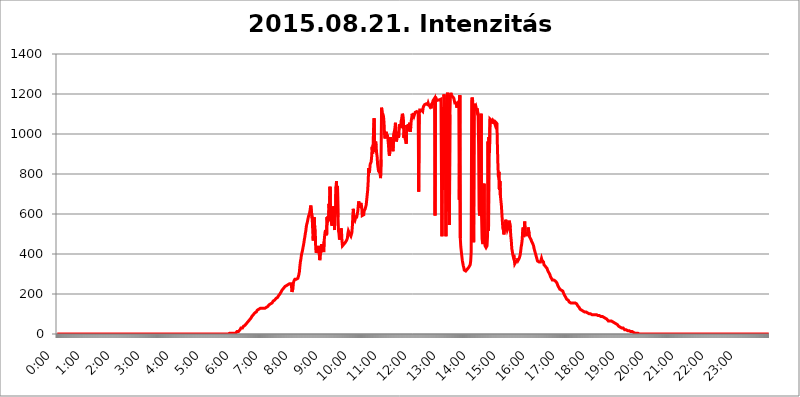
| Category | 2015.08.21. Intenzitás [W/m^2] |
|---|---|
| 0.0 | 0 |
| 0.0006944444444444445 | 0 |
| 0.001388888888888889 | 0 |
| 0.0020833333333333333 | 0 |
| 0.002777777777777778 | 0 |
| 0.003472222222222222 | 0 |
| 0.004166666666666667 | 0 |
| 0.004861111111111111 | 0 |
| 0.005555555555555556 | 0 |
| 0.0062499999999999995 | 0 |
| 0.006944444444444444 | 0 |
| 0.007638888888888889 | 0 |
| 0.008333333333333333 | 0 |
| 0.009027777777777779 | 0 |
| 0.009722222222222222 | 0 |
| 0.010416666666666666 | 0 |
| 0.011111111111111112 | 0 |
| 0.011805555555555555 | 0 |
| 0.012499999999999999 | 0 |
| 0.013194444444444444 | 0 |
| 0.013888888888888888 | 0 |
| 0.014583333333333332 | 0 |
| 0.015277777777777777 | 0 |
| 0.015972222222222224 | 0 |
| 0.016666666666666666 | 0 |
| 0.017361111111111112 | 0 |
| 0.018055555555555557 | 0 |
| 0.01875 | 0 |
| 0.019444444444444445 | 0 |
| 0.02013888888888889 | 0 |
| 0.020833333333333332 | 0 |
| 0.02152777777777778 | 0 |
| 0.022222222222222223 | 0 |
| 0.02291666666666667 | 0 |
| 0.02361111111111111 | 0 |
| 0.024305555555555556 | 0 |
| 0.024999999999999998 | 0 |
| 0.025694444444444447 | 0 |
| 0.02638888888888889 | 0 |
| 0.027083333333333334 | 0 |
| 0.027777777777777776 | 0 |
| 0.02847222222222222 | 0 |
| 0.029166666666666664 | 0 |
| 0.029861111111111113 | 0 |
| 0.030555555555555555 | 0 |
| 0.03125 | 0 |
| 0.03194444444444445 | 0 |
| 0.03263888888888889 | 0 |
| 0.03333333333333333 | 0 |
| 0.034027777777777775 | 0 |
| 0.034722222222222224 | 0 |
| 0.035416666666666666 | 0 |
| 0.036111111111111115 | 0 |
| 0.03680555555555556 | 0 |
| 0.0375 | 0 |
| 0.03819444444444444 | 0 |
| 0.03888888888888889 | 0 |
| 0.03958333333333333 | 0 |
| 0.04027777777777778 | 0 |
| 0.04097222222222222 | 0 |
| 0.041666666666666664 | 0 |
| 0.042361111111111106 | 0 |
| 0.04305555555555556 | 0 |
| 0.043750000000000004 | 0 |
| 0.044444444444444446 | 0 |
| 0.04513888888888889 | 0 |
| 0.04583333333333334 | 0 |
| 0.04652777777777778 | 0 |
| 0.04722222222222222 | 0 |
| 0.04791666666666666 | 0 |
| 0.04861111111111111 | 0 |
| 0.049305555555555554 | 0 |
| 0.049999999999999996 | 0 |
| 0.05069444444444445 | 0 |
| 0.051388888888888894 | 0 |
| 0.052083333333333336 | 0 |
| 0.05277777777777778 | 0 |
| 0.05347222222222222 | 0 |
| 0.05416666666666667 | 0 |
| 0.05486111111111111 | 0 |
| 0.05555555555555555 | 0 |
| 0.05625 | 0 |
| 0.05694444444444444 | 0 |
| 0.057638888888888885 | 0 |
| 0.05833333333333333 | 0 |
| 0.05902777777777778 | 0 |
| 0.059722222222222225 | 0 |
| 0.06041666666666667 | 0 |
| 0.061111111111111116 | 0 |
| 0.06180555555555556 | 0 |
| 0.0625 | 0 |
| 0.06319444444444444 | 0 |
| 0.06388888888888888 | 0 |
| 0.06458333333333334 | 0 |
| 0.06527777777777778 | 0 |
| 0.06597222222222222 | 0 |
| 0.06666666666666667 | 0 |
| 0.06736111111111111 | 0 |
| 0.06805555555555555 | 0 |
| 0.06874999999999999 | 0 |
| 0.06944444444444443 | 0 |
| 0.07013888888888889 | 0 |
| 0.07083333333333333 | 0 |
| 0.07152777777777779 | 0 |
| 0.07222222222222223 | 0 |
| 0.07291666666666667 | 0 |
| 0.07361111111111111 | 0 |
| 0.07430555555555556 | 0 |
| 0.075 | 0 |
| 0.07569444444444444 | 0 |
| 0.0763888888888889 | 0 |
| 0.07708333333333334 | 0 |
| 0.07777777777777778 | 0 |
| 0.07847222222222222 | 0 |
| 0.07916666666666666 | 0 |
| 0.0798611111111111 | 0 |
| 0.08055555555555556 | 0 |
| 0.08125 | 0 |
| 0.08194444444444444 | 0 |
| 0.08263888888888889 | 0 |
| 0.08333333333333333 | 0 |
| 0.08402777777777777 | 0 |
| 0.08472222222222221 | 0 |
| 0.08541666666666665 | 0 |
| 0.08611111111111112 | 0 |
| 0.08680555555555557 | 0 |
| 0.08750000000000001 | 0 |
| 0.08819444444444445 | 0 |
| 0.08888888888888889 | 0 |
| 0.08958333333333333 | 0 |
| 0.09027777777777778 | 0 |
| 0.09097222222222222 | 0 |
| 0.09166666666666667 | 0 |
| 0.09236111111111112 | 0 |
| 0.09305555555555556 | 0 |
| 0.09375 | 0 |
| 0.09444444444444444 | 0 |
| 0.09513888888888888 | 0 |
| 0.09583333333333333 | 0 |
| 0.09652777777777777 | 0 |
| 0.09722222222222222 | 0 |
| 0.09791666666666667 | 0 |
| 0.09861111111111111 | 0 |
| 0.09930555555555555 | 0 |
| 0.09999999999999999 | 0 |
| 0.10069444444444443 | 0 |
| 0.1013888888888889 | 0 |
| 0.10208333333333335 | 0 |
| 0.10277777777777779 | 0 |
| 0.10347222222222223 | 0 |
| 0.10416666666666667 | 0 |
| 0.10486111111111111 | 0 |
| 0.10555555555555556 | 0 |
| 0.10625 | 0 |
| 0.10694444444444444 | 0 |
| 0.1076388888888889 | 0 |
| 0.10833333333333334 | 0 |
| 0.10902777777777778 | 0 |
| 0.10972222222222222 | 0 |
| 0.1111111111111111 | 0 |
| 0.11180555555555556 | 0 |
| 0.11180555555555556 | 0 |
| 0.1125 | 0 |
| 0.11319444444444444 | 0 |
| 0.11388888888888889 | 0 |
| 0.11458333333333333 | 0 |
| 0.11527777777777777 | 0 |
| 0.11597222222222221 | 0 |
| 0.11666666666666665 | 0 |
| 0.1173611111111111 | 0 |
| 0.11805555555555557 | 0 |
| 0.11944444444444445 | 0 |
| 0.12013888888888889 | 0 |
| 0.12083333333333333 | 0 |
| 0.12152777777777778 | 0 |
| 0.12222222222222223 | 0 |
| 0.12291666666666667 | 0 |
| 0.12291666666666667 | 0 |
| 0.12361111111111112 | 0 |
| 0.12430555555555556 | 0 |
| 0.125 | 0 |
| 0.12569444444444444 | 0 |
| 0.12638888888888888 | 0 |
| 0.12708333333333333 | 0 |
| 0.16875 | 0 |
| 0.12847222222222224 | 0 |
| 0.12916666666666668 | 0 |
| 0.12986111111111112 | 0 |
| 0.13055555555555556 | 0 |
| 0.13125 | 0 |
| 0.13194444444444445 | 0 |
| 0.1326388888888889 | 0 |
| 0.13333333333333333 | 0 |
| 0.13402777777777777 | 0 |
| 0.13402777777777777 | 0 |
| 0.13472222222222222 | 0 |
| 0.13541666666666666 | 0 |
| 0.1361111111111111 | 0 |
| 0.13749999999999998 | 0 |
| 0.13819444444444443 | 0 |
| 0.1388888888888889 | 0 |
| 0.13958333333333334 | 0 |
| 0.14027777777777778 | 0 |
| 0.14097222222222222 | 0 |
| 0.14166666666666666 | 0 |
| 0.1423611111111111 | 0 |
| 0.14305555555555557 | 0 |
| 0.14375000000000002 | 0 |
| 0.14444444444444446 | 0 |
| 0.1451388888888889 | 0 |
| 0.1451388888888889 | 0 |
| 0.14652777777777778 | 0 |
| 0.14722222222222223 | 0 |
| 0.14791666666666667 | 0 |
| 0.1486111111111111 | 0 |
| 0.14930555555555555 | 0 |
| 0.15 | 0 |
| 0.15069444444444444 | 0 |
| 0.15138888888888888 | 0 |
| 0.15208333333333332 | 0 |
| 0.15277777777777776 | 0 |
| 0.15347222222222223 | 0 |
| 0.15416666666666667 | 0 |
| 0.15486111111111112 | 0 |
| 0.15555555555555556 | 0 |
| 0.15625 | 0 |
| 0.15694444444444444 | 0 |
| 0.15763888888888888 | 0 |
| 0.15833333333333333 | 0 |
| 0.15902777777777777 | 0 |
| 0.15972222222222224 | 0 |
| 0.16041666666666668 | 0 |
| 0.16111111111111112 | 0 |
| 0.16180555555555556 | 0 |
| 0.1625 | 0 |
| 0.16319444444444445 | 0 |
| 0.1638888888888889 | 0 |
| 0.16458333333333333 | 0 |
| 0.16527777777777777 | 0 |
| 0.16597222222222222 | 0 |
| 0.16666666666666666 | 0 |
| 0.1673611111111111 | 0 |
| 0.16805555555555554 | 0 |
| 0.16874999999999998 | 0 |
| 0.16944444444444443 | 0 |
| 0.17013888888888887 | 0 |
| 0.1708333333333333 | 0 |
| 0.17152777777777775 | 0 |
| 0.17222222222222225 | 0 |
| 0.1729166666666667 | 0 |
| 0.17361111111111113 | 0 |
| 0.17430555555555557 | 0 |
| 0.17500000000000002 | 0 |
| 0.17569444444444446 | 0 |
| 0.1763888888888889 | 0 |
| 0.17708333333333334 | 0 |
| 0.17777777777777778 | 0 |
| 0.17847222222222223 | 0 |
| 0.17916666666666667 | 0 |
| 0.1798611111111111 | 0 |
| 0.18055555555555555 | 0 |
| 0.18125 | 0 |
| 0.18194444444444444 | 0 |
| 0.1826388888888889 | 0 |
| 0.18333333333333335 | 0 |
| 0.1840277777777778 | 0 |
| 0.18472222222222223 | 0 |
| 0.18541666666666667 | 0 |
| 0.18611111111111112 | 0 |
| 0.18680555555555556 | 0 |
| 0.1875 | 0 |
| 0.18819444444444444 | 0 |
| 0.18888888888888888 | 0 |
| 0.18958333333333333 | 0 |
| 0.19027777777777777 | 0 |
| 0.1909722222222222 | 0 |
| 0.19166666666666665 | 0 |
| 0.19236111111111112 | 0 |
| 0.19305555555555554 | 0 |
| 0.19375 | 0 |
| 0.19444444444444445 | 0 |
| 0.1951388888888889 | 0 |
| 0.19583333333333333 | 0 |
| 0.19652777777777777 | 0 |
| 0.19722222222222222 | 0 |
| 0.19791666666666666 | 0 |
| 0.1986111111111111 | 0 |
| 0.19930555555555554 | 0 |
| 0.19999999999999998 | 0 |
| 0.20069444444444443 | 0 |
| 0.20138888888888887 | 0 |
| 0.2020833333333333 | 0 |
| 0.2027777777777778 | 0 |
| 0.2034722222222222 | 0 |
| 0.2041666666666667 | 0 |
| 0.20486111111111113 | 0 |
| 0.20555555555555557 | 0 |
| 0.20625000000000002 | 0 |
| 0.20694444444444446 | 0 |
| 0.2076388888888889 | 0 |
| 0.20833333333333334 | 0 |
| 0.20902777777777778 | 0 |
| 0.20972222222222223 | 0 |
| 0.21041666666666667 | 0 |
| 0.2111111111111111 | 0 |
| 0.21180555555555555 | 0 |
| 0.2125 | 0 |
| 0.21319444444444444 | 0 |
| 0.2138888888888889 | 0 |
| 0.21458333333333335 | 0 |
| 0.2152777777777778 | 0 |
| 0.21597222222222223 | 0 |
| 0.21666666666666667 | 0 |
| 0.21736111111111112 | 0 |
| 0.21805555555555556 | 0 |
| 0.21875 | 0 |
| 0.21944444444444444 | 0 |
| 0.22013888888888888 | 0 |
| 0.22083333333333333 | 0 |
| 0.22152777777777777 | 0 |
| 0.2222222222222222 | 0 |
| 0.22291666666666665 | 0 |
| 0.2236111111111111 | 0 |
| 0.22430555555555556 | 0 |
| 0.225 | 0 |
| 0.22569444444444445 | 0 |
| 0.2263888888888889 | 0 |
| 0.22708333333333333 | 0 |
| 0.22777777777777777 | 0 |
| 0.22847222222222222 | 0 |
| 0.22916666666666666 | 0 |
| 0.2298611111111111 | 0 |
| 0.23055555555555554 | 0 |
| 0.23124999999999998 | 0 |
| 0.23194444444444443 | 0 |
| 0.23263888888888887 | 0 |
| 0.2333333333333333 | 0 |
| 0.2340277777777778 | 0 |
| 0.2347222222222222 | 0 |
| 0.2354166666666667 | 0 |
| 0.23611111111111113 | 0 |
| 0.23680555555555557 | 0 |
| 0.23750000000000002 | 0 |
| 0.23819444444444446 | 0 |
| 0.2388888888888889 | 0 |
| 0.23958333333333334 | 0 |
| 0.24027777777777778 | 3.525 |
| 0.24097222222222223 | 0 |
| 0.24166666666666667 | 3.525 |
| 0.2423611111111111 | 3.525 |
| 0.24305555555555555 | 3.525 |
| 0.24375 | 3.525 |
| 0.24444444444444446 | 3.525 |
| 0.24513888888888888 | 3.525 |
| 0.24583333333333335 | 3.525 |
| 0.2465277777777778 | 3.525 |
| 0.24722222222222223 | 3.525 |
| 0.24791666666666667 | 3.525 |
| 0.24861111111111112 | 3.525 |
| 0.24930555555555556 | 3.525 |
| 0.25 | 3.525 |
| 0.25069444444444444 | 7.887 |
| 0.2513888888888889 | 7.887 |
| 0.2520833333333333 | 12.257 |
| 0.25277777777777777 | 12.257 |
| 0.2534722222222222 | 12.257 |
| 0.25416666666666665 | 12.257 |
| 0.2548611111111111 | 12.257 |
| 0.2555555555555556 | 16.636 |
| 0.25625000000000003 | 21.024 |
| 0.2569444444444445 | 25.419 |
| 0.2576388888888889 | 29.823 |
| 0.25833333333333336 | 29.823 |
| 0.2590277777777778 | 25.419 |
| 0.25972222222222224 | 29.823 |
| 0.2604166666666667 | 34.234 |
| 0.2611111111111111 | 38.653 |
| 0.26180555555555557 | 38.653 |
| 0.2625 | 43.079 |
| 0.26319444444444445 | 43.079 |
| 0.2638888888888889 | 47.511 |
| 0.26458333333333334 | 47.511 |
| 0.2652777777777778 | 51.951 |
| 0.2659722222222222 | 56.398 |
| 0.26666666666666666 | 56.398 |
| 0.2673611111111111 | 60.85 |
| 0.26805555555555555 | 65.31 |
| 0.26875 | 65.31 |
| 0.26944444444444443 | 69.775 |
| 0.2701388888888889 | 74.246 |
| 0.2708333333333333 | 74.246 |
| 0.27152777777777776 | 78.722 |
| 0.2722222222222222 | 83.205 |
| 0.27291666666666664 | 87.692 |
| 0.2736111111111111 | 92.184 |
| 0.2743055555555555 | 92.184 |
| 0.27499999999999997 | 96.682 |
| 0.27569444444444446 | 101.184 |
| 0.27638888888888885 | 101.184 |
| 0.27708333333333335 | 105.69 |
| 0.2777777777777778 | 105.69 |
| 0.27847222222222223 | 110.201 |
| 0.2791666666666667 | 110.201 |
| 0.2798611111111111 | 114.716 |
| 0.28055555555555556 | 119.235 |
| 0.28125 | 119.235 |
| 0.28194444444444444 | 123.758 |
| 0.2826388888888889 | 123.758 |
| 0.2833333333333333 | 128.284 |
| 0.28402777777777777 | 128.284 |
| 0.2847222222222222 | 128.284 |
| 0.28541666666666665 | 128.284 |
| 0.28611111111111115 | 128.284 |
| 0.28680555555555554 | 128.284 |
| 0.28750000000000003 | 128.284 |
| 0.2881944444444445 | 128.284 |
| 0.2888888888888889 | 128.284 |
| 0.28958333333333336 | 128.284 |
| 0.2902777777777778 | 128.284 |
| 0.29097222222222224 | 128.284 |
| 0.2916666666666667 | 132.814 |
| 0.2923611111111111 | 132.814 |
| 0.29305555555555557 | 132.814 |
| 0.29375 | 137.347 |
| 0.29444444444444445 | 137.347 |
| 0.2951388888888889 | 137.347 |
| 0.29583333333333334 | 137.347 |
| 0.2965277777777778 | 141.884 |
| 0.2972222222222222 | 146.423 |
| 0.29791666666666666 | 146.423 |
| 0.2986111111111111 | 150.964 |
| 0.29930555555555555 | 150.964 |
| 0.3 | 155.509 |
| 0.30069444444444443 | 155.509 |
| 0.3013888888888889 | 155.509 |
| 0.3020833333333333 | 160.056 |
| 0.30277777777777776 | 164.605 |
| 0.3034722222222222 | 164.605 |
| 0.30416666666666664 | 164.605 |
| 0.3048611111111111 | 169.156 |
| 0.3055555555555555 | 173.709 |
| 0.30624999999999997 | 173.709 |
| 0.3069444444444444 | 178.264 |
| 0.3076388888888889 | 178.264 |
| 0.30833333333333335 | 182.82 |
| 0.3090277777777778 | 182.82 |
| 0.30972222222222223 | 187.378 |
| 0.3104166666666667 | 191.937 |
| 0.3111111111111111 | 191.937 |
| 0.31180555555555556 | 196.497 |
| 0.3125 | 201.058 |
| 0.31319444444444444 | 205.62 |
| 0.3138888888888889 | 210.182 |
| 0.3145833333333333 | 214.746 |
| 0.31527777777777777 | 219.309 |
| 0.3159722222222222 | 223.873 |
| 0.31666666666666665 | 223.873 |
| 0.31736111111111115 | 228.436 |
| 0.31805555555555554 | 233 |
| 0.31875000000000003 | 233 |
| 0.3194444444444445 | 237.564 |
| 0.3201388888888889 | 237.564 |
| 0.32083333333333336 | 242.127 |
| 0.3215277777777778 | 242.127 |
| 0.32222222222222224 | 242.127 |
| 0.3229166666666667 | 246.689 |
| 0.3236111111111111 | 246.689 |
| 0.32430555555555557 | 246.689 |
| 0.325 | 246.689 |
| 0.32569444444444445 | 251.251 |
| 0.3263888888888889 | 251.251 |
| 0.32708333333333334 | 251.251 |
| 0.3277777777777778 | 251.251 |
| 0.3284722222222222 | 242.127 |
| 0.32916666666666666 | 210.182 |
| 0.3298611111111111 | 210.182 |
| 0.33055555555555555 | 228.436 |
| 0.33125 | 255.813 |
| 0.33194444444444443 | 264.932 |
| 0.3326388888888889 | 269.49 |
| 0.3333333333333333 | 274.047 |
| 0.3340277777777778 | 274.047 |
| 0.3347222222222222 | 278.603 |
| 0.3354166666666667 | 274.047 |
| 0.3361111111111111 | 269.49 |
| 0.3368055555555556 | 278.603 |
| 0.33749999999999997 | 278.603 |
| 0.33819444444444446 | 287.709 |
| 0.33888888888888885 | 296.808 |
| 0.33958333333333335 | 310.44 |
| 0.34027777777777773 | 337.639 |
| 0.34097222222222223 | 360.221 |
| 0.3416666666666666 | 373.729 |
| 0.3423611111111111 | 391.685 |
| 0.3430555555555555 | 405.108 |
| 0.34375 | 414.035 |
| 0.3444444444444445 | 427.39 |
| 0.3451388888888889 | 440.702 |
| 0.3458333333333334 | 453.968 |
| 0.34652777777777777 | 471.582 |
| 0.34722222222222227 | 484.735 |
| 0.34791666666666665 | 502.192 |
| 0.34861111111111115 | 515.223 |
| 0.34930555555555554 | 536.82 |
| 0.35000000000000003 | 549.704 |
| 0.3506944444444444 | 558.261 |
| 0.3513888888888889 | 571.049 |
| 0.3520833333333333 | 583.779 |
| 0.3527777777777778 | 592.233 |
| 0.3534722222222222 | 596.45 |
| 0.3541666666666667 | 609.062 |
| 0.3548611111111111 | 613.252 |
| 0.35555555555555557 | 642.4 |
| 0.35625 | 642.4 |
| 0.35694444444444445 | 642.4 |
| 0.3576388888888889 | 575.299 |
| 0.35833333333333334 | 515.223 |
| 0.3590277777777778 | 467.187 |
| 0.3597222222222222 | 541.121 |
| 0.36041666666666666 | 583.779 |
| 0.3611111111111111 | 532.513 |
| 0.36180555555555555 | 519.555 |
| 0.3625 | 427.39 |
| 0.36319444444444443 | 405.108 |
| 0.3638888888888889 | 414.035 |
| 0.3645833333333333 | 427.39 |
| 0.3652777777777778 | 431.833 |
| 0.3659722222222222 | 418.492 |
| 0.3666666666666667 | 440.702 |
| 0.3673611111111111 | 409.574 |
| 0.3680555555555556 | 369.23 |
| 0.36874999999999997 | 382.715 |
| 0.36944444444444446 | 378.224 |
| 0.37013888888888885 | 387.202 |
| 0.37083333333333335 | 449.551 |
| 0.37152777777777773 | 427.39 |
| 0.37222222222222223 | 436.27 |
| 0.3729166666666666 | 431.833 |
| 0.3736111111111111 | 409.574 |
| 0.3743055555555555 | 462.786 |
| 0.375 | 489.108 |
| 0.3756944444444445 | 510.885 |
| 0.3763888888888889 | 519.555 |
| 0.3770833333333334 | 523.88 |
| 0.37777777777777777 | 493.475 |
| 0.37847222222222227 | 583.779 |
| 0.37916666666666665 | 558.261 |
| 0.37986111111111115 | 588.009 |
| 0.38055555555555554 | 566.793 |
| 0.38125000000000003 | 650.667 |
| 0.3819444444444444 | 617.436 |
| 0.3826388888888889 | 735.89 |
| 0.3833333333333333 | 600.661 |
| 0.3840277777777778 | 575.299 |
| 0.3847222222222222 | 549.704 |
| 0.3854166666666667 | 541.121 |
| 0.3861111111111111 | 553.986 |
| 0.38680555555555557 | 558.261 |
| 0.3875 | 638.256 |
| 0.38819444444444445 | 596.45 |
| 0.3888888888888889 | 519.555 |
| 0.38958333333333334 | 621.613 |
| 0.3902777777777778 | 600.661 |
| 0.3909722222222222 | 735.89 |
| 0.39166666666666666 | 763.674 |
| 0.3923611111111111 | 675.311 |
| 0.39305555555555555 | 739.877 |
| 0.39375 | 583.779 |
| 0.39444444444444443 | 515.223 |
| 0.3951388888888889 | 502.192 |
| 0.3958333333333333 | 471.582 |
| 0.3965277777777778 | 475.972 |
| 0.3972222222222222 | 489.108 |
| 0.3979166666666667 | 528.2 |
| 0.3986111111111111 | 519.555 |
| 0.3993055555555556 | 467.187 |
| 0.39999999999999997 | 440.702 |
| 0.40069444444444446 | 445.129 |
| 0.40138888888888885 | 436.27 |
| 0.40208333333333335 | 449.551 |
| 0.40277777777777773 | 449.551 |
| 0.40347222222222223 | 453.968 |
| 0.4041666666666666 | 458.38 |
| 0.4048611111111111 | 462.786 |
| 0.4055555555555555 | 462.786 |
| 0.40625 | 471.582 |
| 0.4069444444444445 | 480.356 |
| 0.4076388888888889 | 502.192 |
| 0.4083333333333334 | 515.223 |
| 0.40902777777777777 | 510.885 |
| 0.40972222222222227 | 510.885 |
| 0.41041666666666665 | 497.836 |
| 0.41111111111111115 | 497.836 |
| 0.41180555555555554 | 489.108 |
| 0.41250000000000003 | 497.836 |
| 0.4131944444444444 | 506.542 |
| 0.4138888888888889 | 536.82 |
| 0.4145833333333333 | 592.233 |
| 0.4152777777777778 | 625.784 |
| 0.4159722222222222 | 575.299 |
| 0.4166666666666667 | 571.049 |
| 0.4173611111111111 | 566.793 |
| 0.41805555555555557 | 575.299 |
| 0.41875 | 592.233 |
| 0.41944444444444445 | 579.542 |
| 0.4201388888888889 | 588.009 |
| 0.42083333333333334 | 592.233 |
| 0.4215277777777778 | 613.252 |
| 0.4222222222222222 | 642.4 |
| 0.42291666666666666 | 663.019 |
| 0.4236111111111111 | 646.537 |
| 0.42430555555555555 | 629.948 |
| 0.425 | 634.105 |
| 0.42569444444444443 | 654.791 |
| 0.4263888888888889 | 646.537 |
| 0.4270833333333333 | 634.105 |
| 0.4277777777777778 | 592.233 |
| 0.4284722222222222 | 588.009 |
| 0.4291666666666667 | 588.009 |
| 0.4298611111111111 | 596.45 |
| 0.4305555555555556 | 617.436 |
| 0.43124999999999997 | 617.436 |
| 0.43194444444444446 | 625.784 |
| 0.43263888888888885 | 629.948 |
| 0.43333333333333335 | 646.537 |
| 0.43402777777777773 | 671.22 |
| 0.43472222222222223 | 695.666 |
| 0.4354166666666666 | 719.877 |
| 0.4361111111111111 | 763.674 |
| 0.4368055555555555 | 829.981 |
| 0.4375 | 806.757 |
| 0.4381944444444445 | 818.392 |
| 0.4388888888888889 | 849.199 |
| 0.4395833333333334 | 853.029 |
| 0.44027777777777777 | 860.676 |
| 0.44097222222222227 | 887.309 |
| 0.44166666666666665 | 936.33 |
| 0.44236111111111115 | 902.447 |
| 0.44305555555555554 | 947.58 |
| 0.44375000000000003 | 1033.537 |
| 0.4444444444444444 | 1078.555 |
| 0.4451388888888889 | 909.996 |
| 0.4458333333333333 | 955.071 |
| 0.4465277777777778 | 962.555 |
| 0.4472222222222222 | 940.082 |
| 0.4479166666666667 | 906.223 |
| 0.4486111111111111 | 887.309 |
| 0.44930555555555557 | 849.199 |
| 0.45 | 829.981 |
| 0.45069444444444445 | 814.519 |
| 0.4513888888888889 | 814.519 |
| 0.45208333333333334 | 810.641 |
| 0.4527777777777778 | 802.868 |
| 0.4534722222222222 | 779.42 |
| 0.45416666666666666 | 872.114 |
| 0.4548611111111111 | 1131.708 |
| 0.45555555555555555 | 1108.816 |
| 0.45625 | 1105.019 |
| 0.45694444444444443 | 1097.437 |
| 0.4576388888888889 | 1086.097 |
| 0.4583333333333333 | 1056.004 |
| 0.4590277777777778 | 999.916 |
| 0.4597222222222222 | 977.508 |
| 0.4604166666666667 | 999.916 |
| 0.4611111111111111 | 1011.118 |
| 0.4618055555555556 | 999.916 |
| 0.46249999999999997 | 999.916 |
| 0.46319444444444446 | 992.448 |
| 0.46388888888888885 | 970.034 |
| 0.46458333333333335 | 943.832 |
| 0.46527777777777773 | 902.447 |
| 0.46597222222222223 | 891.099 |
| 0.4666666666666666 | 928.819 |
| 0.4673611111111111 | 984.98 |
| 0.4680555555555555 | 940.082 |
| 0.46875 | 958.814 |
| 0.4694444444444445 | 947.58 |
| 0.4701388888888889 | 940.082 |
| 0.4708333333333334 | 913.766 |
| 0.47152777777777777 | 913.766 |
| 0.47222222222222227 | 1003.65 |
| 0.47291666666666665 | 1014.852 |
| 0.47361111111111115 | 1029.798 |
| 0.47430555555555554 | 1056.004 |
| 0.47500000000000003 | 1007.383 |
| 0.4756944444444444 | 962.555 |
| 0.4763888888888889 | 977.508 |
| 0.4770833333333333 | 992.448 |
| 0.4777777777777778 | 1011.118 |
| 0.4784722222222222 | 981.244 |
| 0.4791666666666667 | 992.448 |
| 0.4798611111111111 | 1048.508 |
| 0.48055555555555557 | 1029.798 |
| 0.48125 | 1037.277 |
| 0.48194444444444445 | 1029.798 |
| 0.4826388888888889 | 1067.267 |
| 0.48333333333333334 | 1071.027 |
| 0.4840277777777778 | 1101.226 |
| 0.4847222222222222 | 1093.653 |
| 0.48541666666666666 | 1078.555 |
| 0.4861111111111111 | 981.244 |
| 0.48680555555555555 | 1007.383 |
| 0.4875 | 1011.118 |
| 0.48819444444444443 | 973.772 |
| 0.4888888888888889 | 973.772 |
| 0.4895833333333333 | 951.327 |
| 0.4902777777777778 | 1044.762 |
| 0.4909722222222222 | 1041.019 |
| 0.4916666666666667 | 1014.852 |
| 0.4923611111111111 | 1048.508 |
| 0.4930555555555556 | 1014.852 |
| 0.49374999999999997 | 1048.508 |
| 0.49444444444444446 | 1056.004 |
| 0.49513888888888885 | 1011.118 |
| 0.49583333333333335 | 1037.277 |
| 0.49652777777777773 | 1067.267 |
| 0.49722222222222223 | 1082.324 |
| 0.4979166666666666 | 1101.226 |
| 0.4986111111111111 | 1078.555 |
| 0.4993055555555555 | 1089.873 |
| 0.5 | 1105.019 |
| 0.5006944444444444 | 1093.653 |
| 0.5013888888888889 | 1101.226 |
| 0.5020833333333333 | 1108.816 |
| 0.5027777777777778 | 1108.816 |
| 0.5034722222222222 | 1105.019 |
| 0.5041666666666667 | 1112.618 |
| 0.5048611111111111 | 1116.426 |
| 0.5055555555555555 | 1116.426 |
| 0.50625 | 1105.019 |
| 0.5069444444444444 | 711.832 |
| 0.5076388888888889 | 1097.437 |
| 0.5083333333333333 | 1120.238 |
| 0.5090277777777777 | 1124.056 |
| 0.5097222222222222 | 1124.056 |
| 0.5104166666666666 | 1120.238 |
| 0.5111111111111112 | 1120.238 |
| 0.5118055555555555 | 1120.238 |
| 0.5125000000000001 | 1112.618 |
| 0.5131944444444444 | 1131.708 |
| 0.513888888888889 | 1139.384 |
| 0.5145833333333333 | 1139.384 |
| 0.5152777777777778 | 1147.086 |
| 0.5159722222222222 | 1143.232 |
| 0.5166666666666667 | 1147.086 |
| 0.517361111111111 | 1150.946 |
| 0.5180555555555556 | 1147.086 |
| 0.5187499999999999 | 1150.946 |
| 0.5194444444444445 | 1147.086 |
| 0.5201388888888888 | 1154.814 |
| 0.5208333333333334 | 1147.086 |
| 0.5215277777777778 | 1150.946 |
| 0.5222222222222223 | 1139.384 |
| 0.5229166666666667 | 1150.946 |
| 0.5236111111111111 | 1143.232 |
| 0.5243055555555556 | 1127.879 |
| 0.525 | 1147.086 |
| 0.5256944444444445 | 1150.946 |
| 0.5263888888888889 | 1158.689 |
| 0.5270833333333333 | 1166.46 |
| 0.5277777777777778 | 1162.571 |
| 0.5284722222222222 | 1162.571 |
| 0.5291666666666667 | 1178.177 |
| 0.5298611111111111 | 592.233 |
| 0.5305555555555556 | 1186.03 |
| 0.53125 | 1174.263 |
| 0.5319444444444444 | 1166.46 |
| 0.5326388888888889 | 1162.571 |
| 0.5333333333333333 | 1170.358 |
| 0.5340277777777778 | 1170.358 |
| 0.5347222222222222 | 1170.358 |
| 0.5354166666666667 | 1166.46 |
| 0.5361111111111111 | 1170.358 |
| 0.5368055555555555 | 1174.263 |
| 0.5375 | 1166.46 |
| 0.5381944444444444 | 1174.263 |
| 0.5388888888888889 | 791.169 |
| 0.5395833333333333 | 489.108 |
| 0.5402777777777777 | 1135.543 |
| 0.5409722222222222 | 719.877 |
| 0.5416666666666666 | 1071.027 |
| 0.5423611111111112 | 1197.876 |
| 0.5430555555555555 | 1174.263 |
| 0.5437500000000001 | 999.916 |
| 0.5444444444444444 | 853.029 |
| 0.545138888888889 | 489.108 |
| 0.5458333333333333 | 1135.543 |
| 0.5465277777777778 | 1086.097 |
| 0.5472222222222222 | 1205.82 |
| 0.5479166666666667 | 613.252 |
| 0.548611111111111 | 1041.019 |
| 0.5493055555555556 | 1108.816 |
| 0.5499999999999999 | 545.416 |
| 0.5506944444444445 | 1097.437 |
| 0.5513888888888888 | 1189.969 |
| 0.5520833333333334 | 1205.82 |
| 0.5527777777777778 | 1189.969 |
| 0.5534722222222223 | 1186.03 |
| 0.5541666666666667 | 1186.03 |
| 0.5548611111111111 | 1186.03 |
| 0.5555555555555556 | 1186.03 |
| 0.55625 | 1178.177 |
| 0.5569444444444445 | 1166.46 |
| 0.5576388888888889 | 1154.814 |
| 0.5583333333333333 | 1154.814 |
| 0.5590277777777778 | 1154.814 |
| 0.5597222222222222 | 1154.814 |
| 0.5604166666666667 | 1131.708 |
| 0.5611111111111111 | 1150.946 |
| 0.5618055555555556 | 1147.086 |
| 0.5625 | 1147.086 |
| 0.5631944444444444 | 1162.571 |
| 0.5638888888888889 | 671.22 |
| 0.5645833333333333 | 1193.918 |
| 0.5652777777777778 | 480.356 |
| 0.5659722222222222 | 436.27 |
| 0.5666666666666667 | 414.035 |
| 0.5673611111111111 | 391.685 |
| 0.5680555555555555 | 369.23 |
| 0.56875 | 355.712 |
| 0.5694444444444444 | 342.162 |
| 0.5701388888888889 | 333.113 |
| 0.5708333333333333 | 319.517 |
| 0.5715277777777777 | 314.98 |
| 0.5722222222222222 | 314.98 |
| 0.5729166666666666 | 314.98 |
| 0.5736111111111112 | 314.98 |
| 0.5743055555555555 | 319.517 |
| 0.5750000000000001 | 324.052 |
| 0.5756944444444444 | 324.052 |
| 0.576388888888889 | 328.584 |
| 0.5770833333333333 | 333.113 |
| 0.5777777777777778 | 333.113 |
| 0.5784722222222222 | 337.639 |
| 0.5791666666666667 | 346.682 |
| 0.579861111111111 | 364.728 |
| 0.5805555555555556 | 409.574 |
| 0.5812499999999999 | 1166.46 |
| 0.5819444444444445 | 1182.099 |
| 0.5826388888888888 | 1166.46 |
| 0.5833333333333334 | 970.034 |
| 0.5840277777777778 | 458.38 |
| 0.5847222222222223 | 1150.946 |
| 0.5854166666666667 | 1139.384 |
| 0.5861111111111111 | 1116.426 |
| 0.5868055555555556 | 1120.238 |
| 0.5875 | 1131.708 |
| 0.5881944444444445 | 1120.238 |
| 0.5888888888888889 | 1127.879 |
| 0.5895833333333333 | 1127.879 |
| 0.5902777777777778 | 1093.653 |
| 0.5909722222222222 | 947.58 |
| 0.5916666666666667 | 621.613 |
| 0.5923611111111111 | 592.233 |
| 0.5930555555555556 | 1007.383 |
| 0.59375 | 783.342 |
| 0.5944444444444444 | 1101.226 |
| 0.5951388888888889 | 588.009 |
| 0.5958333333333333 | 475.972 |
| 0.5965277777777778 | 458.38 |
| 0.5972222222222222 | 449.551 |
| 0.5979166666666667 | 449.551 |
| 0.5986111111111111 | 751.803 |
| 0.5993055555555555 | 458.38 |
| 0.6 | 440.702 |
| 0.6006944444444444 | 436.27 |
| 0.6013888888888889 | 431.833 |
| 0.6020833333333333 | 427.39 |
| 0.6027777777777777 | 440.702 |
| 0.6034722222222222 | 489.108 |
| 0.6041666666666666 | 962.555 |
| 0.6048611111111112 | 515.223 |
| 0.6055555555555555 | 984.98 |
| 0.6062500000000001 | 906.223 |
| 0.6069444444444444 | 1074.789 |
| 0.607638888888889 | 1078.555 |
| 0.6083333333333333 | 1074.789 |
| 0.6090277777777778 | 1067.267 |
| 0.6097222222222222 | 1052.255 |
| 0.6104166666666667 | 1059.756 |
| 0.611111111111111 | 1067.267 |
| 0.6118055555555556 | 1067.267 |
| 0.6124999999999999 | 1063.51 |
| 0.6131944444444445 | 1056.004 |
| 0.6138888888888888 | 1048.508 |
| 0.6145833333333334 | 1059.756 |
| 0.6152777777777778 | 1059.756 |
| 0.6159722222222223 | 1056.004 |
| 0.6166666666666667 | 1052.255 |
| 0.6173611111111111 | 936.33 |
| 0.6180555555555556 | 845.365 |
| 0.61875 | 783.342 |
| 0.6194444444444445 | 810.641 |
| 0.6201388888888889 | 719.877 |
| 0.6208333333333333 | 763.674 |
| 0.6215277777777778 | 691.608 |
| 0.6222222222222222 | 691.608 |
| 0.6229166666666667 | 642.4 |
| 0.6236111111111111 | 642.4 |
| 0.6243055555555556 | 562.53 |
| 0.625 | 528.2 |
| 0.6256944444444444 | 519.555 |
| 0.6263888888888889 | 497.836 |
| 0.6270833333333333 | 502.192 |
| 0.6277777777777778 | 536.82 |
| 0.6284722222222222 | 515.223 |
| 0.6291666666666667 | 571.049 |
| 0.6298611111111111 | 541.121 |
| 0.6305555555555555 | 532.513 |
| 0.63125 | 519.555 |
| 0.6319444444444444 | 523.88 |
| 0.6326388888888889 | 532.513 |
| 0.6333333333333333 | 532.513 |
| 0.6340277777777777 | 566.793 |
| 0.6347222222222222 | 566.793 |
| 0.6354166666666666 | 532.513 |
| 0.6361111111111112 | 489.108 |
| 0.6368055555555555 | 467.187 |
| 0.6375000000000001 | 427.39 |
| 0.6381944444444444 | 414.035 |
| 0.638888888888889 | 396.164 |
| 0.6395833333333333 | 387.202 |
| 0.6402777777777778 | 396.164 |
| 0.6409722222222222 | 373.729 |
| 0.6416666666666667 | 351.198 |
| 0.642361111111111 | 351.198 |
| 0.6430555555555556 | 360.221 |
| 0.6437499999999999 | 364.728 |
| 0.6444444444444445 | 364.728 |
| 0.6451388888888888 | 364.728 |
| 0.6458333333333334 | 378.224 |
| 0.6465277777777778 | 369.23 |
| 0.6472222222222223 | 373.729 |
| 0.6479166666666667 | 378.224 |
| 0.6486111111111111 | 387.202 |
| 0.6493055555555556 | 396.164 |
| 0.65 | 414.035 |
| 0.6506944444444445 | 436.27 |
| 0.6513888888888889 | 449.551 |
| 0.6520833333333333 | 471.582 |
| 0.6527777777777778 | 515.223 |
| 0.6534722222222222 | 532.513 |
| 0.6541666666666667 | 484.735 |
| 0.6548611111111111 | 497.836 |
| 0.6555555555555556 | 562.53 |
| 0.65625 | 515.223 |
| 0.6569444444444444 | 493.475 |
| 0.6576388888888889 | 506.542 |
| 0.6583333333333333 | 497.836 |
| 0.6590277777777778 | 489.108 |
| 0.6597222222222222 | 502.192 |
| 0.6604166666666667 | 532.513 |
| 0.6611111111111111 | 532.513 |
| 0.6618055555555555 | 502.192 |
| 0.6625 | 484.735 |
| 0.6631944444444444 | 484.735 |
| 0.6638888888888889 | 484.735 |
| 0.6645833333333333 | 471.582 |
| 0.6652777777777777 | 462.786 |
| 0.6659722222222222 | 458.38 |
| 0.6666666666666666 | 453.968 |
| 0.6673611111111111 | 449.551 |
| 0.6680555555555556 | 440.702 |
| 0.6687500000000001 | 427.39 |
| 0.6694444444444444 | 418.492 |
| 0.6701388888888888 | 409.574 |
| 0.6708333333333334 | 400.638 |
| 0.6715277777777778 | 391.685 |
| 0.6722222222222222 | 382.715 |
| 0.6729166666666666 | 373.729 |
| 0.6736111111111112 | 364.728 |
| 0.6743055555555556 | 360.221 |
| 0.6749999999999999 | 360.221 |
| 0.6756944444444444 | 360.221 |
| 0.6763888888888889 | 360.221 |
| 0.6770833333333334 | 360.221 |
| 0.6777777777777777 | 360.221 |
| 0.6784722222222223 | 364.728 |
| 0.6791666666666667 | 378.224 |
| 0.6798611111111111 | 369.23 |
| 0.6805555555555555 | 364.728 |
| 0.68125 | 364.728 |
| 0.6819444444444445 | 360.221 |
| 0.6826388888888889 | 346.682 |
| 0.6833333333333332 | 346.682 |
| 0.6840277777777778 | 342.162 |
| 0.6847222222222222 | 337.639 |
| 0.6854166666666667 | 337.639 |
| 0.686111111111111 | 333.113 |
| 0.6868055555555556 | 328.584 |
| 0.6875 | 324.052 |
| 0.6881944444444444 | 314.98 |
| 0.688888888888889 | 310.44 |
| 0.6895833333333333 | 305.898 |
| 0.6902777777777778 | 301.354 |
| 0.6909722222222222 | 296.808 |
| 0.6916666666666668 | 287.709 |
| 0.6923611111111111 | 283.156 |
| 0.6930555555555555 | 278.603 |
| 0.69375 | 274.047 |
| 0.6944444444444445 | 269.49 |
| 0.6951388888888889 | 269.49 |
| 0.6958333333333333 | 269.49 |
| 0.6965277777777777 | 269.49 |
| 0.6972222222222223 | 269.49 |
| 0.6979166666666666 | 264.932 |
| 0.6986111111111111 | 264.932 |
| 0.6993055555555556 | 264.932 |
| 0.7000000000000001 | 260.373 |
| 0.7006944444444444 | 255.813 |
| 0.7013888888888888 | 251.251 |
| 0.7020833333333334 | 242.127 |
| 0.7027777777777778 | 237.564 |
| 0.7034722222222222 | 233 |
| 0.7041666666666666 | 228.436 |
| 0.7048611111111112 | 223.873 |
| 0.7055555555555556 | 219.309 |
| 0.7062499999999999 | 219.309 |
| 0.7069444444444444 | 219.309 |
| 0.7076388888888889 | 219.309 |
| 0.7083333333333334 | 214.746 |
| 0.7090277777777777 | 214.746 |
| 0.7097222222222223 | 210.182 |
| 0.7104166666666667 | 201.058 |
| 0.7111111111111111 | 196.497 |
| 0.7118055555555555 | 191.937 |
| 0.7125 | 187.378 |
| 0.7131944444444445 | 182.82 |
| 0.7138888888888889 | 178.264 |
| 0.7145833333333332 | 173.709 |
| 0.7152777777777778 | 173.709 |
| 0.7159722222222222 | 169.156 |
| 0.7166666666666667 | 169.156 |
| 0.717361111111111 | 164.605 |
| 0.7180555555555556 | 160.056 |
| 0.71875 | 160.056 |
| 0.7194444444444444 | 155.509 |
| 0.720138888888889 | 155.509 |
| 0.7208333333333333 | 155.509 |
| 0.7215277777777778 | 155.509 |
| 0.7222222222222222 | 155.509 |
| 0.7229166666666668 | 155.509 |
| 0.7236111111111111 | 155.509 |
| 0.7243055555555555 | 155.509 |
| 0.725 | 155.509 |
| 0.7256944444444445 | 155.509 |
| 0.7263888888888889 | 155.509 |
| 0.7270833333333333 | 155.509 |
| 0.7277777777777777 | 150.964 |
| 0.7284722222222223 | 150.964 |
| 0.7291666666666666 | 146.423 |
| 0.7298611111111111 | 141.884 |
| 0.7305555555555556 | 137.347 |
| 0.7312500000000001 | 137.347 |
| 0.7319444444444444 | 132.814 |
| 0.7326388888888888 | 128.284 |
| 0.7333333333333334 | 123.758 |
| 0.7340277777777778 | 123.758 |
| 0.7347222222222222 | 119.235 |
| 0.7354166666666666 | 119.235 |
| 0.7361111111111112 | 119.235 |
| 0.7368055555555556 | 114.716 |
| 0.7374999999999999 | 114.716 |
| 0.7381944444444444 | 114.716 |
| 0.7388888888888889 | 114.716 |
| 0.7395833333333334 | 110.201 |
| 0.7402777777777777 | 110.201 |
| 0.7409722222222223 | 110.201 |
| 0.7416666666666667 | 110.201 |
| 0.7423611111111111 | 105.69 |
| 0.7430555555555555 | 105.69 |
| 0.74375 | 105.69 |
| 0.7444444444444445 | 101.184 |
| 0.7451388888888889 | 101.184 |
| 0.7458333333333332 | 101.184 |
| 0.7465277777777778 | 101.184 |
| 0.7472222222222222 | 101.184 |
| 0.7479166666666667 | 101.184 |
| 0.748611111111111 | 96.682 |
| 0.7493055555555556 | 96.682 |
| 0.75 | 96.682 |
| 0.7506944444444444 | 96.682 |
| 0.751388888888889 | 96.682 |
| 0.7520833333333333 | 96.682 |
| 0.7527777777777778 | 96.682 |
| 0.7534722222222222 | 96.682 |
| 0.7541666666666668 | 96.682 |
| 0.7548611111111111 | 96.682 |
| 0.7555555555555555 | 96.682 |
| 0.75625 | 96.682 |
| 0.7569444444444445 | 96.682 |
| 0.7576388888888889 | 92.184 |
| 0.7583333333333333 | 92.184 |
| 0.7590277777777777 | 92.184 |
| 0.7597222222222223 | 92.184 |
| 0.7604166666666666 | 92.184 |
| 0.7611111111111111 | 92.184 |
| 0.7618055555555556 | 87.692 |
| 0.7625000000000001 | 87.692 |
| 0.7631944444444444 | 87.692 |
| 0.7638888888888888 | 87.692 |
| 0.7645833333333334 | 87.692 |
| 0.7652777777777778 | 83.205 |
| 0.7659722222222222 | 83.205 |
| 0.7666666666666666 | 83.205 |
| 0.7673611111111112 | 83.205 |
| 0.7680555555555556 | 78.722 |
| 0.7687499999999999 | 78.722 |
| 0.7694444444444444 | 74.246 |
| 0.7701388888888889 | 74.246 |
| 0.7708333333333334 | 74.246 |
| 0.7715277777777777 | 69.775 |
| 0.7722222222222223 | 69.775 |
| 0.7729166666666667 | 65.31 |
| 0.7736111111111111 | 65.31 |
| 0.7743055555555555 | 65.31 |
| 0.775 | 65.31 |
| 0.7756944444444445 | 65.31 |
| 0.7763888888888889 | 65.31 |
| 0.7770833333333332 | 65.31 |
| 0.7777777777777778 | 60.85 |
| 0.7784722222222222 | 60.85 |
| 0.7791666666666667 | 60.85 |
| 0.779861111111111 | 60.85 |
| 0.7805555555555556 | 56.398 |
| 0.78125 | 56.398 |
| 0.7819444444444444 | 56.398 |
| 0.782638888888889 | 51.951 |
| 0.7833333333333333 | 51.951 |
| 0.7840277777777778 | 51.951 |
| 0.7847222222222222 | 47.511 |
| 0.7854166666666668 | 47.511 |
| 0.7861111111111111 | 43.079 |
| 0.7868055555555555 | 43.079 |
| 0.7875 | 38.653 |
| 0.7881944444444445 | 38.653 |
| 0.7888888888888889 | 38.653 |
| 0.7895833333333333 | 34.234 |
| 0.7902777777777777 | 34.234 |
| 0.7909722222222223 | 34.234 |
| 0.7916666666666666 | 29.823 |
| 0.7923611111111111 | 29.823 |
| 0.7930555555555556 | 29.823 |
| 0.7937500000000001 | 29.823 |
| 0.7944444444444444 | 25.419 |
| 0.7951388888888888 | 25.419 |
| 0.7958333333333334 | 21.024 |
| 0.7965277777777778 | 21.024 |
| 0.7972222222222222 | 21.024 |
| 0.7979166666666666 | 21.024 |
| 0.7986111111111112 | 21.024 |
| 0.7993055555555556 | 21.024 |
| 0.7999999999999999 | 16.636 |
| 0.8006944444444444 | 16.636 |
| 0.8013888888888889 | 16.636 |
| 0.8020833333333334 | 16.636 |
| 0.8027777777777777 | 12.257 |
| 0.8034722222222223 | 12.257 |
| 0.8041666666666667 | 12.257 |
| 0.8048611111111111 | 12.257 |
| 0.8055555555555555 | 12.257 |
| 0.80625 | 12.257 |
| 0.8069444444444445 | 7.887 |
| 0.8076388888888889 | 7.887 |
| 0.8083333333333332 | 7.887 |
| 0.8090277777777778 | 7.887 |
| 0.8097222222222222 | 7.887 |
| 0.8104166666666667 | 3.525 |
| 0.811111111111111 | 3.525 |
| 0.8118055555555556 | 3.525 |
| 0.8125 | 3.525 |
| 0.8131944444444444 | 3.525 |
| 0.813888888888889 | 3.525 |
| 0.8145833333333333 | 3.525 |
| 0.8152777777777778 | 0 |
| 0.8159722222222222 | 0 |
| 0.8166666666666668 | 0 |
| 0.8173611111111111 | 0 |
| 0.8180555555555555 | 0 |
| 0.81875 | 0 |
| 0.8194444444444445 | 0 |
| 0.8201388888888889 | 0 |
| 0.8208333333333333 | 0 |
| 0.8215277777777777 | 0 |
| 0.8222222222222223 | 0 |
| 0.8229166666666666 | 0 |
| 0.8236111111111111 | 0 |
| 0.8243055555555556 | 0 |
| 0.8250000000000001 | 0 |
| 0.8256944444444444 | 0 |
| 0.8263888888888888 | 0 |
| 0.8270833333333334 | 0 |
| 0.8277777777777778 | 0 |
| 0.8284722222222222 | 0 |
| 0.8291666666666666 | 0 |
| 0.8298611111111112 | 0 |
| 0.8305555555555556 | 0 |
| 0.8312499999999999 | 0 |
| 0.8319444444444444 | 0 |
| 0.8326388888888889 | 0 |
| 0.8333333333333334 | 0 |
| 0.8340277777777777 | 0 |
| 0.8347222222222223 | 0 |
| 0.8354166666666667 | 0 |
| 0.8361111111111111 | 0 |
| 0.8368055555555555 | 0 |
| 0.8375 | 0 |
| 0.8381944444444445 | 0 |
| 0.8388888888888889 | 0 |
| 0.8395833333333332 | 0 |
| 0.8402777777777778 | 0 |
| 0.8409722222222222 | 0 |
| 0.8416666666666667 | 0 |
| 0.842361111111111 | 0 |
| 0.8430555555555556 | 0 |
| 0.84375 | 0 |
| 0.8444444444444444 | 0 |
| 0.845138888888889 | 0 |
| 0.8458333333333333 | 0 |
| 0.8465277777777778 | 0 |
| 0.8472222222222222 | 0 |
| 0.8479166666666668 | 0 |
| 0.8486111111111111 | 0 |
| 0.8493055555555555 | 0 |
| 0.85 | 0 |
| 0.8506944444444445 | 0 |
| 0.8513888888888889 | 0 |
| 0.8520833333333333 | 0 |
| 0.8527777777777777 | 0 |
| 0.8534722222222223 | 0 |
| 0.8541666666666666 | 0 |
| 0.8548611111111111 | 0 |
| 0.8555555555555556 | 0 |
| 0.8562500000000001 | 0 |
| 0.8569444444444444 | 0 |
| 0.8576388888888888 | 0 |
| 0.8583333333333334 | 0 |
| 0.8590277777777778 | 0 |
| 0.8597222222222222 | 0 |
| 0.8604166666666666 | 0 |
| 0.8611111111111112 | 0 |
| 0.8618055555555556 | 0 |
| 0.8624999999999999 | 0 |
| 0.8631944444444444 | 0 |
| 0.8638888888888889 | 0 |
| 0.8645833333333334 | 0 |
| 0.8652777777777777 | 0 |
| 0.8659722222222223 | 0 |
| 0.8666666666666667 | 0 |
| 0.8673611111111111 | 0 |
| 0.8680555555555555 | 0 |
| 0.86875 | 0 |
| 0.8694444444444445 | 0 |
| 0.8701388888888889 | 0 |
| 0.8708333333333332 | 0 |
| 0.8715277777777778 | 0 |
| 0.8722222222222222 | 0 |
| 0.8729166666666667 | 0 |
| 0.873611111111111 | 0 |
| 0.8743055555555556 | 0 |
| 0.875 | 0 |
| 0.8756944444444444 | 0 |
| 0.876388888888889 | 0 |
| 0.8770833333333333 | 0 |
| 0.8777777777777778 | 0 |
| 0.8784722222222222 | 0 |
| 0.8791666666666668 | 0 |
| 0.8798611111111111 | 0 |
| 0.8805555555555555 | 0 |
| 0.88125 | 0 |
| 0.8819444444444445 | 0 |
| 0.8826388888888889 | 0 |
| 0.8833333333333333 | 0 |
| 0.8840277777777777 | 0 |
| 0.8847222222222223 | 0 |
| 0.8854166666666666 | 0 |
| 0.8861111111111111 | 0 |
| 0.8868055555555556 | 0 |
| 0.8875000000000001 | 0 |
| 0.8881944444444444 | 0 |
| 0.8888888888888888 | 0 |
| 0.8895833333333334 | 0 |
| 0.8902777777777778 | 0 |
| 0.8909722222222222 | 0 |
| 0.8916666666666666 | 0 |
| 0.8923611111111112 | 0 |
| 0.8930555555555556 | 0 |
| 0.8937499999999999 | 0 |
| 0.8944444444444444 | 0 |
| 0.8951388888888889 | 0 |
| 0.8958333333333334 | 0 |
| 0.8965277777777777 | 0 |
| 0.8972222222222223 | 0 |
| 0.8979166666666667 | 0 |
| 0.8986111111111111 | 0 |
| 0.8993055555555555 | 0 |
| 0.9 | 0 |
| 0.9006944444444445 | 0 |
| 0.9013888888888889 | 0 |
| 0.9020833333333332 | 0 |
| 0.9027777777777778 | 0 |
| 0.9034722222222222 | 0 |
| 0.9041666666666667 | 0 |
| 0.904861111111111 | 0 |
| 0.9055555555555556 | 0 |
| 0.90625 | 0 |
| 0.9069444444444444 | 0 |
| 0.907638888888889 | 0 |
| 0.9083333333333333 | 0 |
| 0.9090277777777778 | 0 |
| 0.9097222222222222 | 0 |
| 0.9104166666666668 | 0 |
| 0.9111111111111111 | 0 |
| 0.9118055555555555 | 0 |
| 0.9125 | 0 |
| 0.9131944444444445 | 0 |
| 0.9138888888888889 | 0 |
| 0.9145833333333333 | 0 |
| 0.9152777777777777 | 0 |
| 0.9159722222222223 | 0 |
| 0.9166666666666666 | 0 |
| 0.9173611111111111 | 0 |
| 0.9180555555555556 | 0 |
| 0.9187500000000001 | 0 |
| 0.9194444444444444 | 0 |
| 0.9201388888888888 | 0 |
| 0.9208333333333334 | 0 |
| 0.9215277777777778 | 0 |
| 0.9222222222222222 | 0 |
| 0.9229166666666666 | 0 |
| 0.9236111111111112 | 0 |
| 0.9243055555555556 | 0 |
| 0.9249999999999999 | 0 |
| 0.9256944444444444 | 0 |
| 0.9263888888888889 | 0 |
| 0.9270833333333334 | 0 |
| 0.9277777777777777 | 0 |
| 0.9284722222222223 | 0 |
| 0.9291666666666667 | 0 |
| 0.9298611111111111 | 0 |
| 0.9305555555555555 | 0 |
| 0.93125 | 0 |
| 0.9319444444444445 | 0 |
| 0.9326388888888889 | 0 |
| 0.9333333333333332 | 0 |
| 0.9340277777777778 | 0 |
| 0.9347222222222222 | 0 |
| 0.9354166666666667 | 0 |
| 0.936111111111111 | 0 |
| 0.9368055555555556 | 0 |
| 0.9375 | 0 |
| 0.9381944444444444 | 0 |
| 0.938888888888889 | 0 |
| 0.9395833333333333 | 0 |
| 0.9402777777777778 | 0 |
| 0.9409722222222222 | 0 |
| 0.9416666666666668 | 0 |
| 0.9423611111111111 | 0 |
| 0.9430555555555555 | 0 |
| 0.94375 | 0 |
| 0.9444444444444445 | 0 |
| 0.9451388888888889 | 0 |
| 0.9458333333333333 | 0 |
| 0.9465277777777777 | 0 |
| 0.9472222222222223 | 0 |
| 0.9479166666666666 | 0 |
| 0.9486111111111111 | 0 |
| 0.9493055555555556 | 0 |
| 0.9500000000000001 | 0 |
| 0.9506944444444444 | 0 |
| 0.9513888888888888 | 0 |
| 0.9520833333333334 | 0 |
| 0.9527777777777778 | 0 |
| 0.9534722222222222 | 0 |
| 0.9541666666666666 | 0 |
| 0.9548611111111112 | 0 |
| 0.9555555555555556 | 0 |
| 0.9562499999999999 | 0 |
| 0.9569444444444444 | 0 |
| 0.9576388888888889 | 0 |
| 0.9583333333333334 | 0 |
| 0.9590277777777777 | 0 |
| 0.9597222222222223 | 0 |
| 0.9604166666666667 | 0 |
| 0.9611111111111111 | 0 |
| 0.9618055555555555 | 0 |
| 0.9625 | 0 |
| 0.9631944444444445 | 0 |
| 0.9638888888888889 | 0 |
| 0.9645833333333332 | 0 |
| 0.9652777777777778 | 0 |
| 0.9659722222222222 | 0 |
| 0.9666666666666667 | 0 |
| 0.967361111111111 | 0 |
| 0.9680555555555556 | 0 |
| 0.96875 | 0 |
| 0.9694444444444444 | 0 |
| 0.970138888888889 | 0 |
| 0.9708333333333333 | 0 |
| 0.9715277777777778 | 0 |
| 0.9722222222222222 | 0 |
| 0.9729166666666668 | 0 |
| 0.9736111111111111 | 0 |
| 0.9743055555555555 | 0 |
| 0.975 | 0 |
| 0.9756944444444445 | 0 |
| 0.9763888888888889 | 0 |
| 0.9770833333333333 | 0 |
| 0.9777777777777777 | 0 |
| 0.9784722222222223 | 0 |
| 0.9791666666666666 | 0 |
| 0.9798611111111111 | 0 |
| 0.9805555555555556 | 0 |
| 0.9812500000000001 | 0 |
| 0.9819444444444444 | 0 |
| 0.9826388888888888 | 0 |
| 0.9833333333333334 | 0 |
| 0.9840277777777778 | 0 |
| 0.9847222222222222 | 0 |
| 0.9854166666666666 | 0 |
| 0.9861111111111112 | 0 |
| 0.9868055555555556 | 0 |
| 0.9874999999999999 | 0 |
| 0.9881944444444444 | 0 |
| 0.9888888888888889 | 0 |
| 0.9895833333333334 | 0 |
| 0.9902777777777777 | 0 |
| 0.9909722222222223 | 0 |
| 0.9916666666666667 | 0 |
| 0.9923611111111111 | 0 |
| 0.9930555555555555 | 0 |
| 0.99375 | 0 |
| 0.9944444444444445 | 0 |
| 0.9951388888888889 | 0 |
| 0.9958333333333332 | 0 |
| 0.9965277777777778 | 0 |
| 0.9972222222222222 | 0 |
| 0.9979166666666667 | 0 |
| 0.998611111111111 | 0 |
| 0.9993055555555556 | 0 |